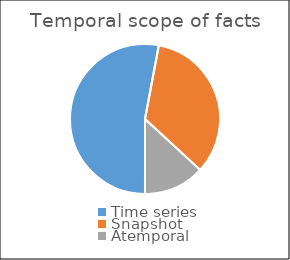
| Category | Number of Facts |
|---|---|
| Time series | 520 |
| Snapshot | 333 |
| Atemporal | 129 |